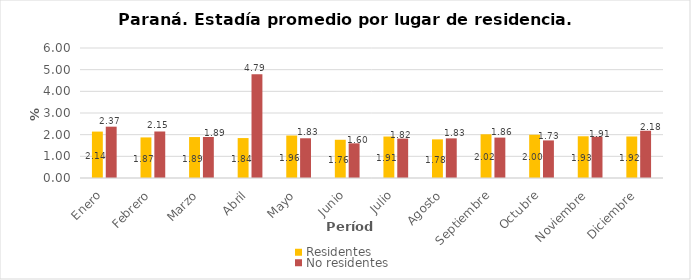
| Category | Residentes | No residentes |
|---|---|---|
| Enero | 2.142 | 2.369 |
| Febrero | 1.873 | 2.147 |
| Marzo | 1.89 | 1.893 |
| Abril | 1.843 | 4.788 |
| Mayo | 1.96 | 1.834 |
| Junio | 1.765 | 1.6 |
| Julio | 1.914 | 1.819 |
| Agosto | 1.783 | 1.829 |
| Septiembre | 2.018 | 1.865 |
| Octubre | 1.997 | 1.735 |
| Noviembre | 1.926 | 1.905 |
| Diciembre | 1.915 | 2.182 |